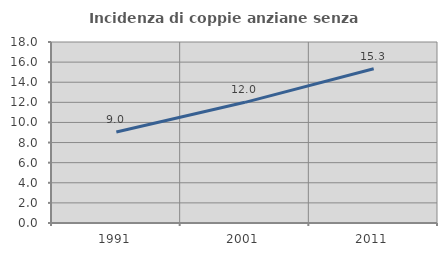
| Category | Incidenza di coppie anziane senza figli  |
|---|---|
| 1991.0 | 9.045 |
| 2001.0 | 12 |
| 2011.0 | 15.344 |